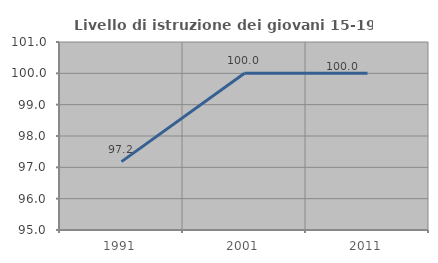
| Category | Livello di istruzione dei giovani 15-19 anni |
|---|---|
| 1991.0 | 97.183 |
| 2001.0 | 100 |
| 2011.0 | 100 |